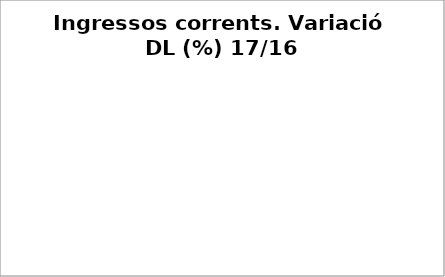
| Category | Series 0 |
|---|---|
| Impostos locals | 0.113 |
| Participació Tributs de l'Estat | 0.169 |
| Taxes i altres ingressos | 0.024 |
| Transferències corrents (exc. FCF) | 0.465 |
| Ingressos patrimonials | 0.186 |
| Ingressos corrents | 0.137 |